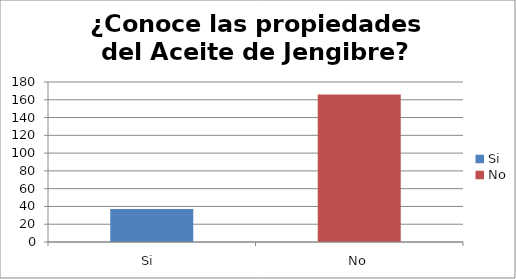
| Category | ¿Conoce las propiedades del Aceite de Jengibre? |
|---|---|
| Si  | 37 |
| No | 166 |